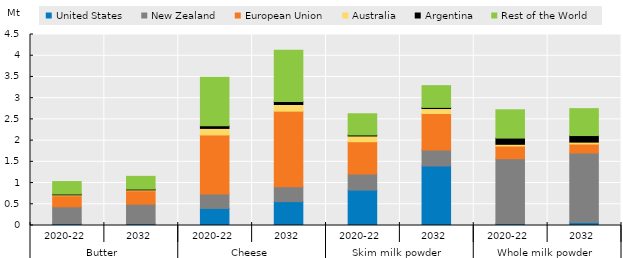
| Category | United States | New Zealand | European Union | Australia | Argentina | Rest of the World |
|---|---|---|---|---|---|---|
| 0 | 0.043 | 0.397 | 0.262 | 0.019 | 0.02 | 0.294 |
| 1 | 0.04 | 0.462 | 0.318 | 0.018 | 0.02 | 0.301 |
| 2 | 0.403 | 0.34 | 1.391 | 0.154 | 0.065 | 1.139 |
| 3 | 0.562 | 0.35 | 1.782 | 0.157 | 0.069 | 1.211 |
| 4 | 0.834 | 0.377 | 0.763 | 0.135 | 0.024 | 0.499 |
| 5 | 1.402 | 0.379 | 0.856 | 0.118 | 0.027 | 0.512 |
| 6 | 0.044 | 1.53 | 0.299 | 0.04 | 0.146 | 0.667 |
| 7 | 0.071 | 1.636 | 0.213 | 0.045 | 0.154 | 0.634 |